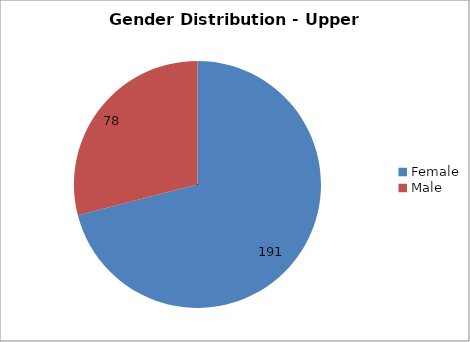
| Category | Series 0 | Series 1 |
|---|---|---|
| Female | 191 | 191 |
| Male | 78 | 78 |